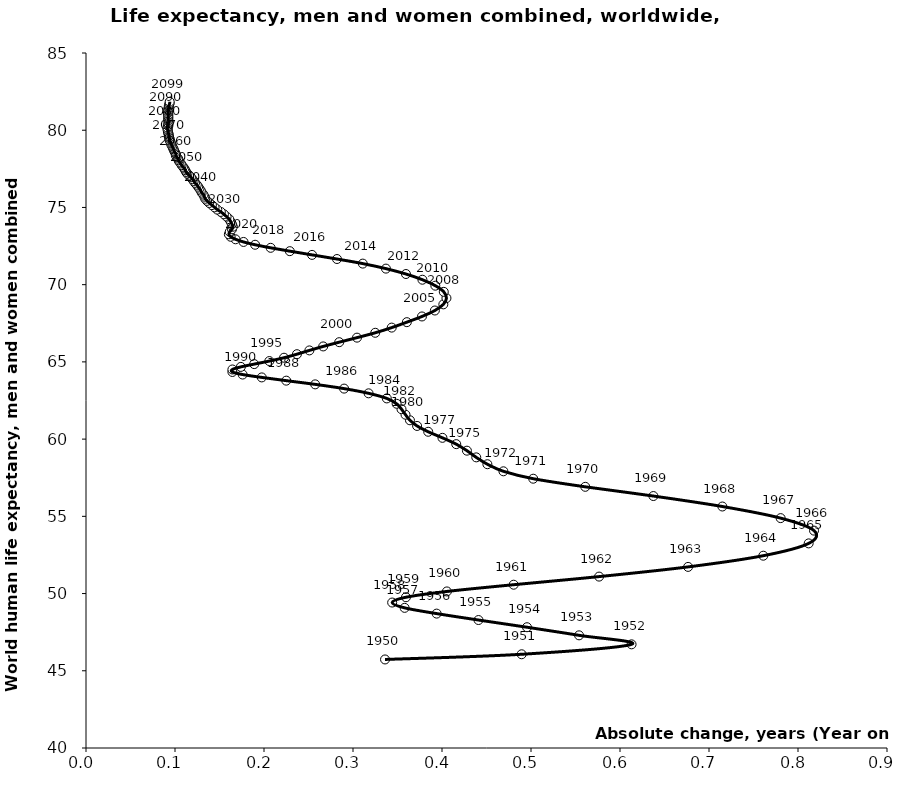
| Category | Series 0 |
|---|---|
| 0.3360000000000056 | 45.733 |
| 0.48950000000000315 | 46.069 |
| 0.6129999999999995 | 46.712 |
| 0.5539999999999985 | 47.295 |
| 0.49549999999999983 | 47.82 |
| 0.44099999999999895 | 48.286 |
| 0.39399999999999835 | 48.702 |
| 0.35800000000000054 | 49.074 |
| 0.3440000000000012 | 49.418 |
| 0.3595000000000006 | 49.762 |
| 0.40549999999999997 | 50.137 |
| 0.48049999999999926 | 50.573 |
| 0.5764999999999993 | 51.098 |
| 0.6765000000000008 | 51.726 |
| 0.7609999999999992 | 52.451 |
| 0.8120000000000012 | 53.248 |
| 0.8180000000000014 | 54.075 |
| 0.7805 | 54.884 |
| 0.7149999999999999 | 55.636 |
| 0.6374999999999993 | 56.314 |
| 0.5609999999999999 | 56.911 |
| 0.5024999999999977 | 57.436 |
| 0.4690000000000012 | 57.916 |
| 0.4510000000000005 | 58.374 |
| 0.43849999999999767 | 58.818 |
| 0.4280000000000008 | 59.251 |
| 0.41600000000000037 | 59.674 |
| 0.40050000000000097 | 60.083 |
| 0.3844999999999992 | 60.475 |
| 0.3719999999999999 | 60.852 |
| 0.36400000000000077 | 61.219 |
| 0.3589999999999982 | 61.58 |
| 0.3545000000000016 | 61.937 |
| 0.3490000000000002 | 62.289 |
| 0.33800000000000097 | 62.635 |
| 0.31750000000000256 | 62.965 |
| 0.28999999999999915 | 63.27 |
| 0.25749999999999673 | 63.545 |
| 0.22499999999999787 | 63.785 |
| 0.19750000000000512 | 63.995 |
| 0.17599999999999838 | 64.18 |
| 0.16449999999999676 | 64.347 |
| 0.16450000000000387 | 64.509 |
| 0.1739999999999995 | 64.676 |
| 0.18900000000000006 | 64.857 |
| 0.20600000000000307 | 65.054 |
| 0.2224999999999966 | 65.269 |
| 0.23699999999999477 | 65.499 |
| 0.2510000000000048 | 65.743 |
| 0.2665000000000006 | 66.001 |
| 0.2844999999999942 | 66.276 |
| 0.30450000000000443 | 66.57 |
| 0.32500000000000284 | 66.885 |
| 0.3434999999999988 | 67.22 |
| 0.3605000000000018 | 67.572 |
| 0.3774999999999977 | 67.941 |
| 0.3919999999999959 | 68.327 |
| 0.40149999999999864 | 68.725 |
| 0.40500000000000114 | 69.13 |
| 0.402000000000001 | 69.535 |
| 0.3924999999999983 | 69.934 |
| 0.3780000000000001 | 70.32 |
| 0.35950000000000415 | 70.69 |
| 0.3370000000000033 | 71.039 |
| 0.31099999999999994 | 71.364 |
| 0.2819999999999965 | 71.661 |
| 0.2539999999999978 | 71.928 |
| 0.2289999999999992 | 72.169 |
| 0.20750000000000313 | 72.386 |
| 0.19000000000000483 | 72.584 |
| 0.1769999999999996 | 72.766 |
| 0.16799999999999926 | 72.938 |
| 0.16250000000000142 | 73.102 |
| 0.16049999999999898 | 73.263 |
| 0.16149999999999665 | 73.423 |
| 0.16400000000000148 | 73.586 |
| 0.16499999999999915 | 73.751 |
| 0.16399999999999437 | 73.916 |
| 0.16250000000000142 | 74.079 |
| 0.16100000000000136 | 74.241 |
| 0.15800000000000125 | 74.401 |
| 0.15500000000000114 | 74.557 |
| 0.15149999999999864 | 74.711 |
| 0.14750000000000085 | 74.86 |
| 0.14450000000000074 | 75.006 |
| 0.14150000000000063 | 75.149 |
| 0.1385000000000005 | 75.289 |
| 0.13600000000000279 | 75.426 |
| 0.13400000000000034 | 75.561 |
| 0.13299999999999557 | 75.694 |
| 0.1319999999999979 | 75.827 |
| 0.13000000000000256 | 75.958 |
| 0.12899999999999778 | 76.087 |
| 0.12749999999999773 | 76.216 |
| 0.12600000000000477 | 76.342 |
| 0.12449999999999761 | 76.468 |
| 0.12249999999999517 | 76.591 |
| 0.12100000000000222 | 76.713 |
| 0.11950000000000216 | 76.833 |
| 0.1180000000000021 | 76.952 |
| 0.11599999999999966 | 77.069 |
| 0.11399999999999721 | 77.184 |
| 0.11250000000000426 | 77.297 |
| 0.11149999999999949 | 77.409 |
| 0.11049999999999471 | 77.52 |
| 0.10900000000000176 | 77.63 |
| 0.1075000000000017 | 77.738 |
| 0.10649999999999693 | 77.845 |
| 0.10500000000000398 | 77.951 |
| 0.10400000000000631 | 78.055 |
| 0.10349999999999682 | 78.159 |
| 0.10199999999999676 | 78.262 |
| 0.10099999999999909 | 78.363 |
| 0.10099999999999909 | 78.464 |
| 0.10000000000000142 | 78.565 |
| 0.09900000000000375 | 78.664 |
| 0.09850000000000136 | 78.763 |
| 0.09749999999999659 | 78.861 |
| 0.09700000000000131 | 78.958 |
| 0.09600000000000364 | 79.055 |
| 0.09549999999999415 | 79.15 |
| 0.09499999999999886 | 79.246 |
| 0.0940000000000012 | 79.34 |
| 0.0940000000000012 | 79.434 |
| 0.0934999999999988 | 79.528 |
| 0.09299999999999642 | 79.621 |
| 0.09300000000000352 | 79.714 |
| 0.09250000000000114 | 79.807 |
| 0.09199999999999875 | 79.899 |
| 0.09199999999999875 | 79.991 |
| 0.09150000000000347 | 80.083 |
| 0.09150000000000347 | 80.174 |
| 0.09249999999999403 | 80.266 |
| 0.09249999999999403 | 80.359 |
| 0.09250000000000114 | 80.451 |
| 0.09300000000000352 | 80.544 |
| 0.09250000000000114 | 80.637 |
| 0.09250000000000114 | 80.729 |
| 0.09250000000000114 | 80.822 |
| 0.09250000000000114 | 80.914 |
| 0.09250000000000114 | 81.007 |
| 0.09199999999999875 | 81.099 |
| 0.09250000000000114 | 81.191 |
| 0.09250000000000114 | 81.284 |
| 0.09249999999999403 | 81.376 |
| 0.09299999999999642 | 81.469 |
| 0.09300000000000352 | 81.562 |
| 0.0934999999999988 | 81.655 |
| 0.0940000000000012 | 81.749 |
| 0.0940000000000083 | 81.843 |